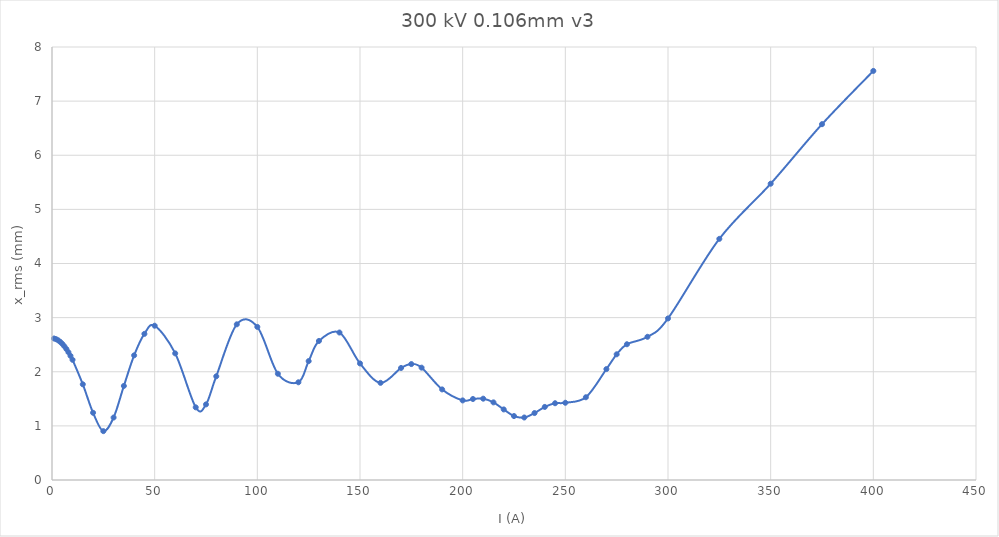
| Category | Series 0 |
|---|---|
| 1.0 | 2.614 |
| 2.0 | 2.602 |
| 3.0 | 2.581 |
| 4.0 | 2.552 |
| 5.0 | 2.516 |
| 6.0 | 2.472 |
| 7.0 | 2.42 |
| 8.0 | 2.361 |
| 9.0 | 2.294 |
| 10.0 | 2.221 |
| 15.0 | 1.768 |
| 20.0 | 1.242 |
| 25.0 | 0.903 |
| 30.0 | 1.154 |
| 35.0 | 1.738 |
| 40.0 | 2.303 |
| 45.0 | 2.7 |
| 50.0 | 2.85 |
| 60.0 | 2.34 |
| 70.0 | 1.342 |
| 75.0 | 1.397 |
| 80.0 | 1.916 |
| 90.0 | 2.876 |
| 100.0 | 2.828 |
| 110.0 | 1.963 |
| 120.0 | 1.805 |
| 125.0 | 2.197 |
| 130.0 | 2.569 |
| 140.0 | 2.725 |
| 150.0 | 2.153 |
| 160.0 | 1.795 |
| 170.0 | 2.07 |
| 175.0 | 2.142 |
| 180.0 | 2.076 |
| 190.0 | 1.673 |
| 200.0 | 1.47 |
| 205.0 | 1.496 |
| 210.0 | 1.502 |
| 215.0 | 1.434 |
| 220.0 | 1.304 |
| 225.0 | 1.181 |
| 230.0 | 1.155 |
| 235.0 | 1.237 |
| 240.0 | 1.35 |
| 245.0 | 1.418 |
| 250.0 | 1.427 |
| 260.0 | 1.528 |
| 270.0 | 2.049 |
| 275.0 | 2.322 |
| 280.0 | 2.508 |
| 290.0 | 2.646 |
| 300.0 | 2.985 |
| 325.0 | 4.455 |
| 350.0 | 5.474 |
| 375.0 | 6.574 |
| 400.0 | 7.558 |